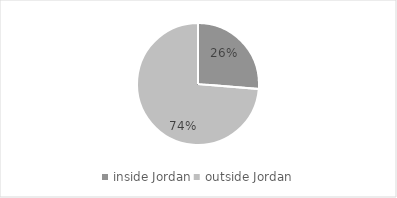
| Category | % |
|---|---|
| inside Jordan | 0.263 |
| outside Jordan | 0.737 |